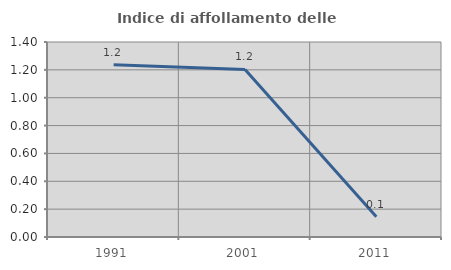
| Category | Indice di affollamento delle abitazioni  |
|---|---|
| 1991.0 | 1.236 |
| 2001.0 | 1.203 |
| 2011.0 | 0.145 |